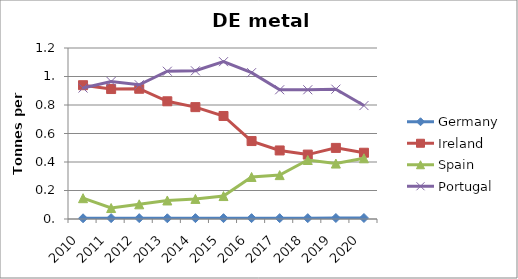
| Category | Germany | Ireland | Spain | Portugal |
|---|---|---|---|---|
| 2010 | 0.005 | 0.939 | 0.146 | 0.919 |
| 2011 | 0.006 | 0.912 | 0.077 | 0.965 |
| 2012 | 0.006 | 0.914 | 0.103 | 0.942 |
| 2013 | 0.005 | 0.826 | 0.13 | 1.037 |
| 2014 | 0.006 | 0.785 | 0.141 | 1.04 |
| 2015 | 0.006 | 0.723 | 0.161 | 1.104 |
| 2016 | 0.006 | 0.547 | 0.295 | 1.027 |
| 2017 | 0.006 | 0.481 | 0.308 | 0.907 |
| 2018 | 0.006 | 0.452 | 0.414 | 0.907 |
| 2019 | 0.007 | 0.499 | 0.389 | 0.911 |
| 2020 | 0.007 | 0.465 | 0.426 | 0.796 |